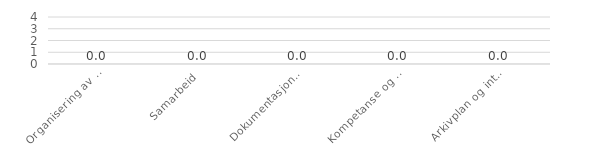
| Category | Series 5 |
|---|---|
| Organisering av arkivet | 0 |
| Samarbeid | 0 |
| Dokumentasjonskrav og -behov | 0 |
| Kompetanse og opplæring | 0 |
| Arkivplan og internkontroll | 0 |